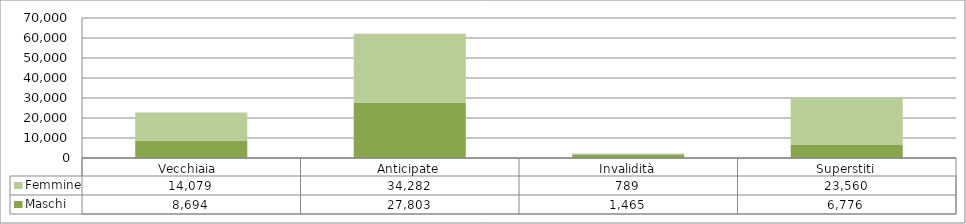
| Category | Maschi | Femmine |
|---|---|---|
| Vecchiaia  | 8694 | 14079 |
| Anticipate | 27803 | 34282 |
| Invalidità | 1465 | 789 |
| Superstiti | 6776 | 23560 |